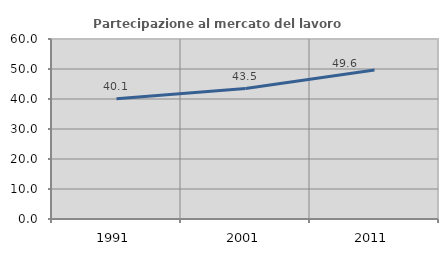
| Category | Partecipazione al mercato del lavoro  femminile |
|---|---|
| 1991.0 | 40.096 |
| 2001.0 | 43.474 |
| 2011.0 | 49.644 |